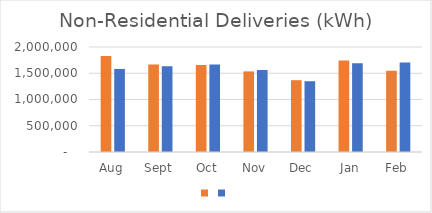
| Category | Series 1 | Series 0 |
|---|---|---|
| Aug | 1829758 | 1582276 |
| Sept | 1665239 | 1633351 |
| Oct | 1657467 | 1665276 |
| Nov | 1535448 | 1561812 |
| Dec | 1367905 | 1348000 |
| Jan | 1741151 | 1691318 |
| Feb | 1548063 | 1705422 |